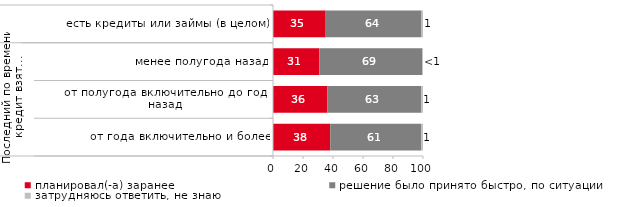
| Category | планировал(-а) заранее | решение было принято быстро, по ситуации | затрудняюсь ответить, не знаю |
|---|---|---|---|
| 0 | 35.118 | 63.885 | 0.996 |
| 1 | 30.864 | 68.724 | 0.412 |
| 2 | 36.257 | 62.573 | 1.17 |
| 3 | 38.196 | 60.743 | 1.061 |